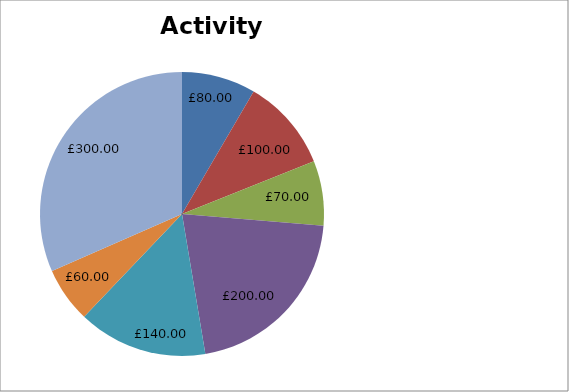
| Category | clown Balloon Artist DJ Magician Face paining and facepaint kits trampoline carousel bumper cars |
|---|---|
| clown Balloon Artist | 80 |
| DJ | 100 |
| Magician | 70 |
| Face paining and facepaint kits | 200 |
| trampoline | 140 |
| carousel | 60 |
| bumper cars | 300 |